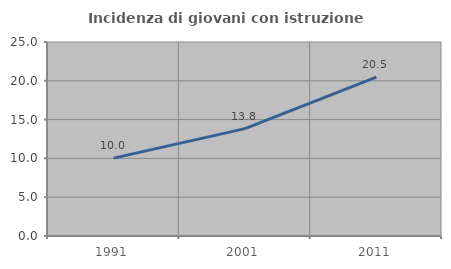
| Category | Incidenza di giovani con istruzione universitaria |
|---|---|
| 1991.0 | 10.037 |
| 2001.0 | 13.834 |
| 2011.0 | 20.465 |